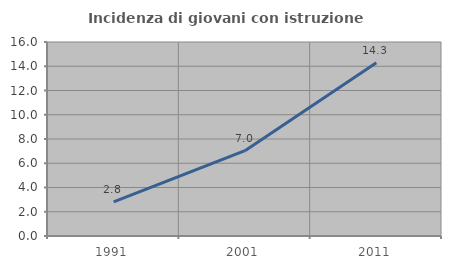
| Category | Incidenza di giovani con istruzione universitaria |
|---|---|
| 1991.0 | 2.812 |
| 2001.0 | 7.038 |
| 2011.0 | 14.286 |